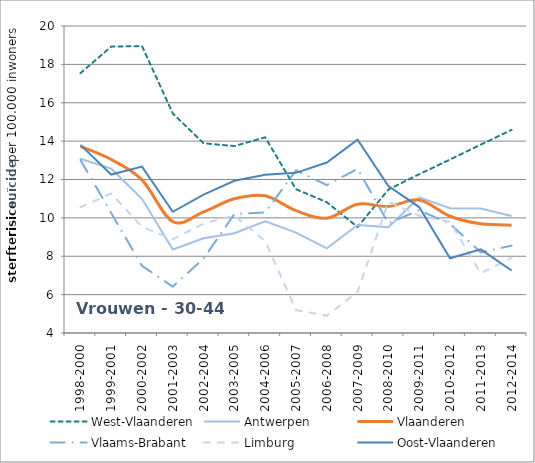
| Category | West-Vlaanderen | Antwerpen | Vlaanderen | Vlaams-Brabant | Limburg | Oost-Vlaanderen |
|---|---|---|---|---|---|---|
| 1998-2000 | 17.541 | 13.08 | 13.73 | 13.02 | 10.553 | 13.805 |
| 1999-2001 | 18.925 | 12.565 | 13.045 | 10.253 | 11.271 | 12.259 |
| 2000-2002 | 18.955 | 10.996 | 11.981 | 7.501 | 9.529 | 12.674 |
| 2001-2003 | 15.44 | 8.353 | 9.802 | 6.419 | 8.886 | 10.319 |
| 2002-2004 | 13.889 | 8.934 | 10.31 | 7.881 | 9.7 | 11.213 |
| 2003-2005 | 13.742 | 9.201 | 10.994 | 10.201 | 10.128 | 11.936 |
| 2004-2006 | 14.195 | 9.819 | 11.149 | 10.284 | 8.784 | 12.25 |
| 2005-2007 | 11.495 | 9.234 | 10.377 | 12.475 | 5.196 | 12.347 |
| 2006-2008 | 10.817 | 8.41 | 9.981 | 11.709 | 4.903 | 12.885 |
| 2007-2009 | 9.523 | 9.628 | 10.712 | 12.554 | 6.142 | 14.077 |
| 2008-2010 | 11.476 | 9.513 | 10.595 | 9.717 | 10.843 | 11.656 |
| 2009-2011 | 12.275 | 11.071 | 10.932 | 10.403 | 10.111 | 10.564 |
| 2010-2012 | 13.041 | 10.506 | 10.085 | 9.689 | 9.795 | 7.892 |
| 2011-2013 | 13.817 | 10.49 | 9.689 | 8.204 | 7.111 | 8.357 |
| 2012-2014 | 14.586 | 10.1 | 9.621 | 8.552 | 7.925 | 7.259 |